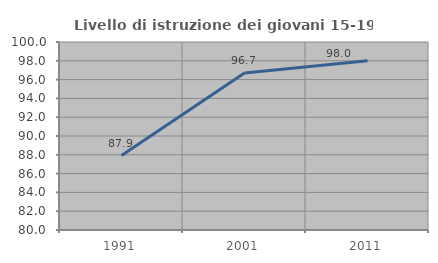
| Category | Livello di istruzione dei giovani 15-19 anni |
|---|---|
| 1991.0 | 87.921 |
| 2001.0 | 96.713 |
| 2011.0 | 98.011 |